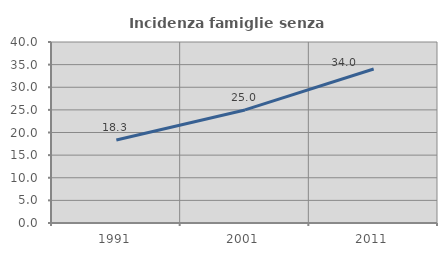
| Category | Incidenza famiglie senza nuclei |
|---|---|
| 1991.0 | 18.337 |
| 2001.0 | 24.989 |
| 2011.0 | 34.024 |